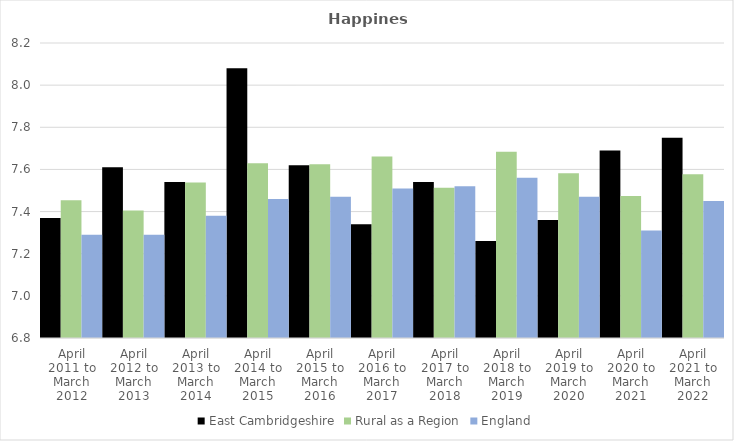
| Category | East Cambridgeshire | Rural as a Region | England |
|---|---|---|---|
| April 2011 to March 2012 | 7.37 | 7.454 | 7.29 |
| April 2012 to March 2013 | 7.61 | 7.406 | 7.29 |
| April 2013 to March 2014 | 7.54 | 7.539 | 7.38 |
| April 2014 to March 2015 | 8.08 | 7.63 | 7.46 |
| April 2015 to March 2016 | 7.62 | 7.625 | 7.47 |
| April 2016 to March 2017 | 7.34 | 7.661 | 7.51 |
| April 2017 to March 2018 | 7.54 | 7.513 | 7.52 |
| April 2018 to March 2019 | 7.26 | 7.684 | 7.56 |
| April 2019 to March 2020 | 7.36 | 7.582 | 7.47 |
| April 2020 to March 2021 | 7.69 | 7.474 | 7.31 |
| April 2021 to March 2022 | 7.75 | 7.577 | 7.45 |